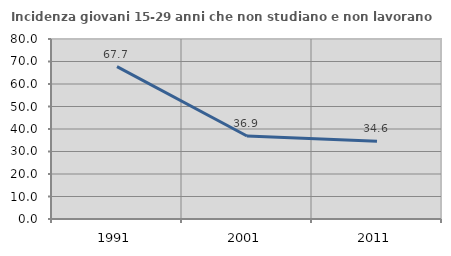
| Category | Incidenza giovani 15-29 anni che non studiano e non lavorano  |
|---|---|
| 1991.0 | 67.742 |
| 2001.0 | 36.866 |
| 2011.0 | 34.606 |